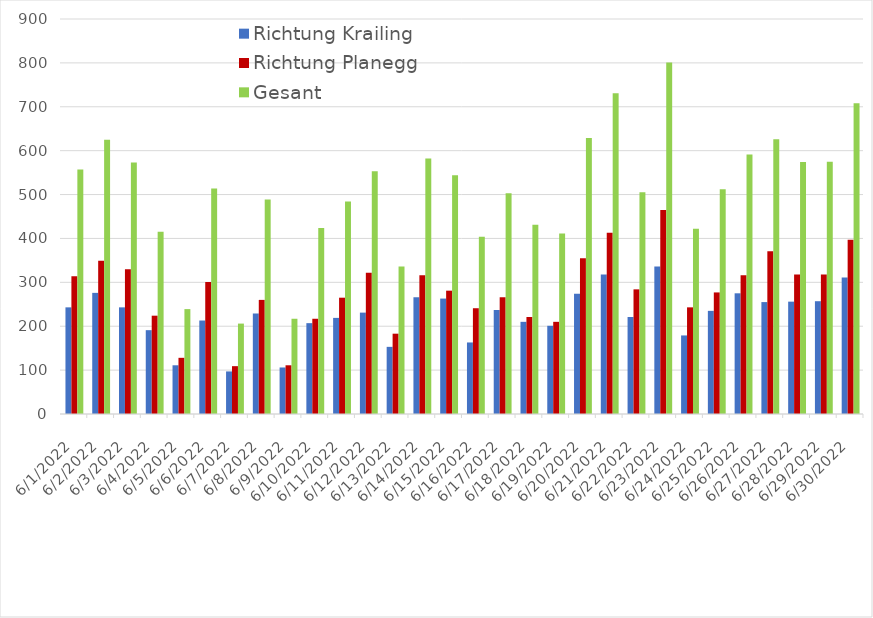
| Category | Richtung Krailing | Richtung Planegg | Gesant |
|---|---|---|---|
| 6/1/22 | 243 | 314 | 557 |
| 6/2/22 | 276 | 349 | 625 |
| 6/3/22 | 243 | 330 | 573 |
| 6/4/22 | 191 | 224 | 415 |
| 6/5/22 | 111 | 128 | 239 |
| 6/6/22 | 213 | 301 | 514 |
| 6/7/22 | 97 | 109 | 206 |
| 6/8/22 | 229 | 260 | 489 |
| 6/9/22 | 106 | 111 | 217 |
| 6/10/22 | 207 | 217 | 424 |
| 6/11/22 | 219 | 265 | 484 |
| 6/12/22 | 231 | 322 | 553 |
| 6/13/22 | 153 | 183 | 336 |
| 6/14/22 | 266 | 316 | 582 |
| 6/15/22 | 263 | 281 | 544 |
| 6/16/22 | 163 | 241 | 404 |
| 6/17/22 | 237 | 266 | 503 |
| 6/18/22 | 210 | 221 | 431 |
| 6/19/22 | 201 | 210 | 411 |
| 6/20/22 | 274 | 355 | 629 |
| 6/21/22 | 318 | 413 | 731 |
| 6/22/22 | 221 | 284 | 505 |
| 6/23/22 | 336 | 465 | 801 |
| 6/24/22 | 179 | 243 | 422 |
| 6/25/22 | 235 | 277 | 512 |
| 6/26/22 | 275 | 316 | 591 |
| 6/27/22 | 255 | 371 | 626 |
| 6/28/22 | 256 | 318 | 574 |
| 6/29/22 | 257 | 318 | 575 |
| 6/30/22 | 311 | 397 | 708 |